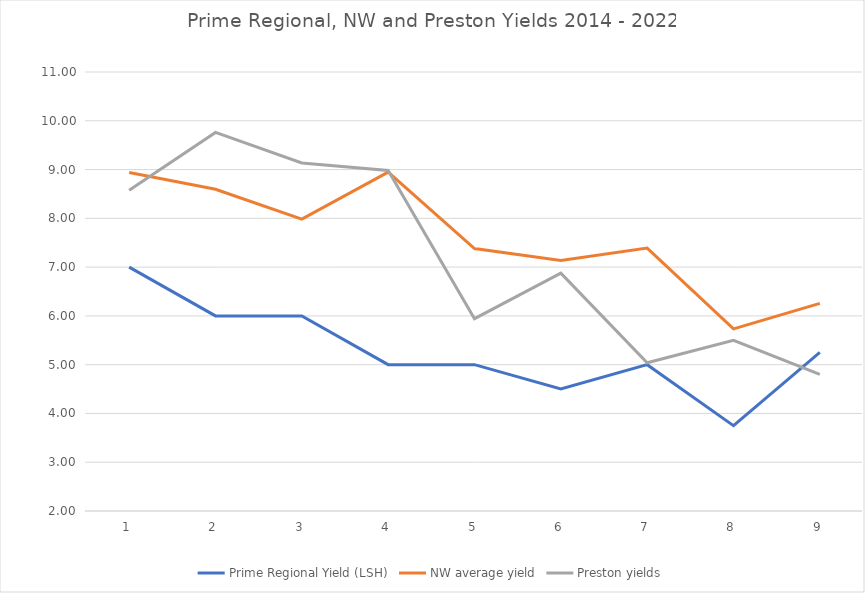
| Category | Prime Regional Yield (LSH) | NW average yield | Preston yields |
|---|---|---|---|
| 0 | 7 | 8.941 | 8.577 |
| 1 | 6 | 8.597 | 9.761 |
| 2 | 6 | 7.984 | 9.135 |
| 3 | 5 | 8.947 | 8.98 |
| 4 | 5 | 7.38 | 5.943 |
| 5 | 4.5 | 7.136 | 6.875 |
| 6 | 5 | 7.39 | 5.04 |
| 7 | 3.75 | 5.733 | 5.5 |
| 8 | 5.25 | 6.257 | 4.8 |